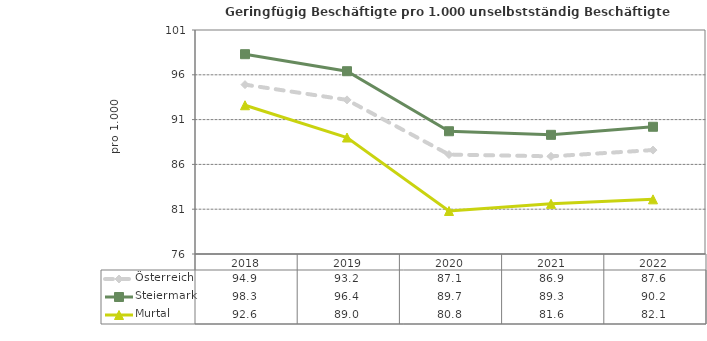
| Category | Österreich | Steiermark | Murtal |
|---|---|---|---|
| 2022.0 | 87.6 | 90.2 | 82.1 |
| 2021.0 | 86.9 | 89.3 | 81.6 |
| 2020.0 | 87.1 | 89.7 | 80.8 |
| 2019.0 | 93.2 | 96.4 | 89 |
| 2018.0 | 94.9 | 98.3 | 92.6 |